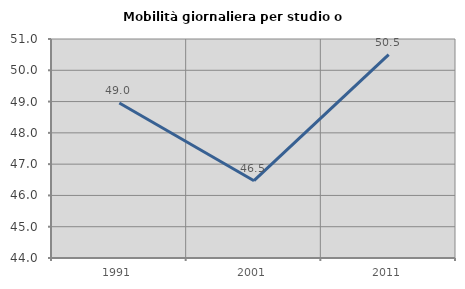
| Category | Mobilità giornaliera per studio o lavoro |
|---|---|
| 1991.0 | 48.953 |
| 2001.0 | 46.471 |
| 2011.0 | 50.502 |